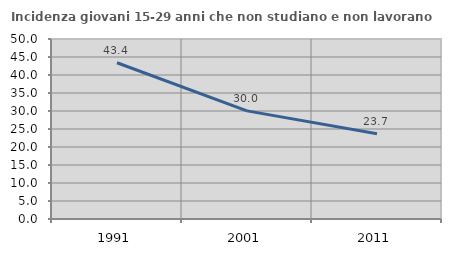
| Category | Incidenza giovani 15-29 anni che non studiano e non lavorano  |
|---|---|
| 1991.0 | 43.411 |
| 2001.0 | 30.038 |
| 2011.0 | 23.684 |